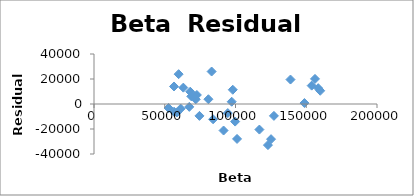
| Category | Series 0 |
|---|---|
| 59809.8 | 23874.418 |
| 68769.3 | 6143.407 |
| 70999.0 | 6086.132 |
| 72702.1 | 7220.511 |
| 68025.9 | 9832.95 |
| 63147.4 | 13081.908 |
| 56543.6 | 14016.492 |
| 58627.5 | -6762.087 |
| 56589.8 | -6188.214 |
| 52678.7 | -3201.268 |
| 61275.0 | -3704.128 |
| 74517.4 | -9512.167 |
| 67338.6 | -2311.685 |
| 71881.3 | 3729.54 |
| 84175.6 | -12234.977 |
| 80859.3 | 3807.725 |
| 83132.9 | 25977.993 |
| 97323.7 | 1815.401 |
| 98067.2 | 11401.547 |
| 99746.4 | -14066.375 |
| 94553.2 | -7255.131 |
| 91574.3 | -21214.184 |
| 101097.6 | -27937.98 |
| 122921.6 | -32879.585 |
| 116905.6 | -20456.486 |
| 125131.9 | -28135.159 |
| 127134.9 | -9507.972 |
| 148723.6 | 763.415 |
| 138859.4 | 19573.845 |
| 156176.2 | 20086.369 |
| 153837.1 | 14696.597 |
| 158444.1 | 12667.955 |
| 159879.9 | 10591.194 |